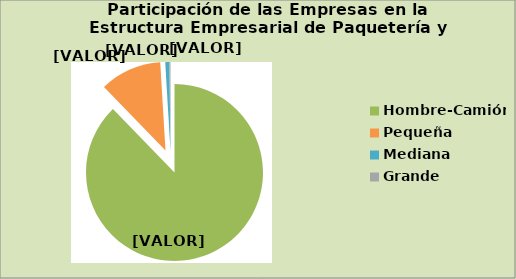
| Category | Series 0 |
|---|---|
| Hombre-Camión | 87.719 |
| Pequeña | 11.278 |
| Mediana | 0.752 |
| Grande | 0.2 |